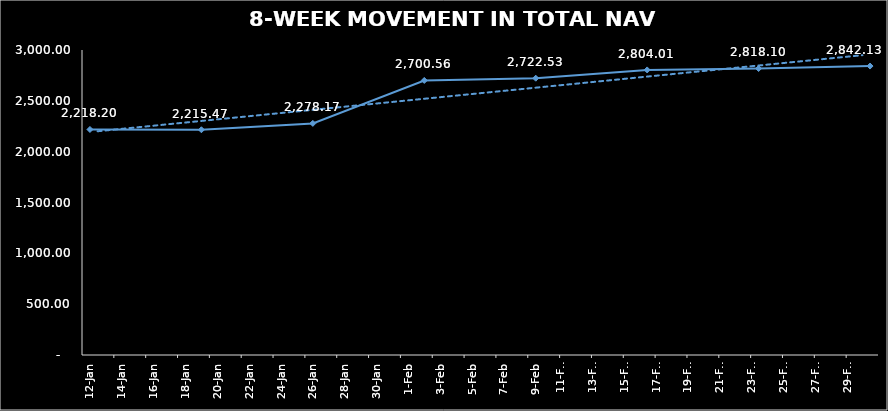
| Category | TOTAL NAV |
|---|---|
| 2024-01-12 | 2218.205 |
| 2024-01-19 | 2215.471 |
| 2024-01-26 | 2278.172 |
| 2024-02-02 | 2700.559 |
| 2024-02-09 | 2722.532 |
| 2024-02-16 | 2804.014 |
| 2024-02-23 | 2818.099 |
| 2024-03-01 | 2842.127 |